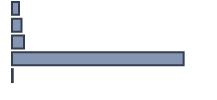
| Category | Series 0 |
|---|---|
| 0 | 3.446 |
| 1 | 4.788 |
| 2 | 6.003 |
| 3 | 85.393 |
| 4 | 0.37 |